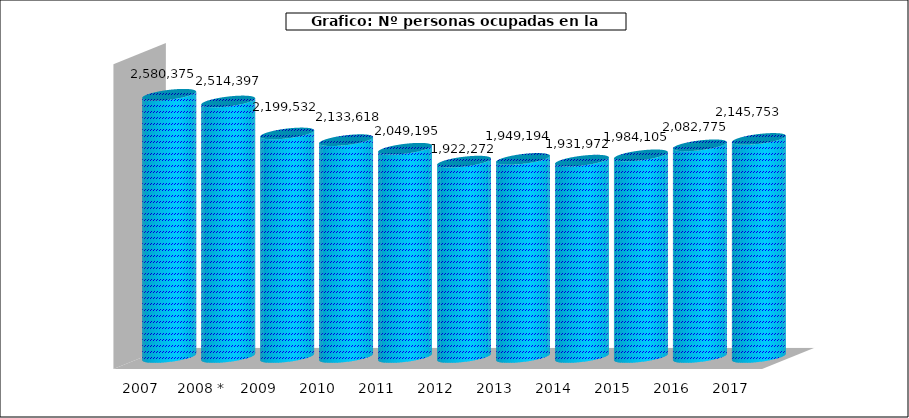
| Category |  Nº personas ocupadas |
|---|---|
| 2007 | 2580375 |
|  2008 * | 2514397 |
| 2009 | 2199532 |
| 2010 | 2133618 |
| 2011 | 2049195 |
| 2012 | 1922272 |
| 2013 | 1949194 |
| 2014 | 1931972 |
| 2015 | 1984105 |
| 2016 | 2082775 |
| 2017 | 2145753 |